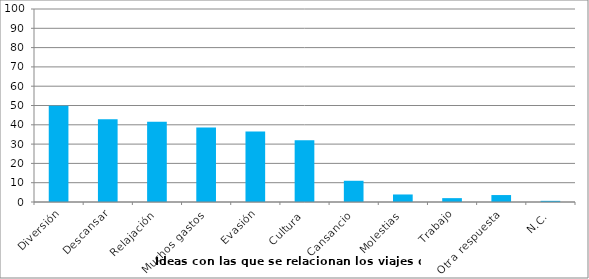
| Category | % |
|---|---|
| Diversión | 49.9 |
| Descansar | 42.9 |
| Relajación | 41.6 |
| Muchos gastos | 38.6 |
| Evasión | 36.5 |
| Cultura | 32 |
| Cansancio | 11 |
| Molestias | 3.9 |
| Trabajo | 2 |
| Otra respuesta | 3.6 |
| N.C. | 0.6 |